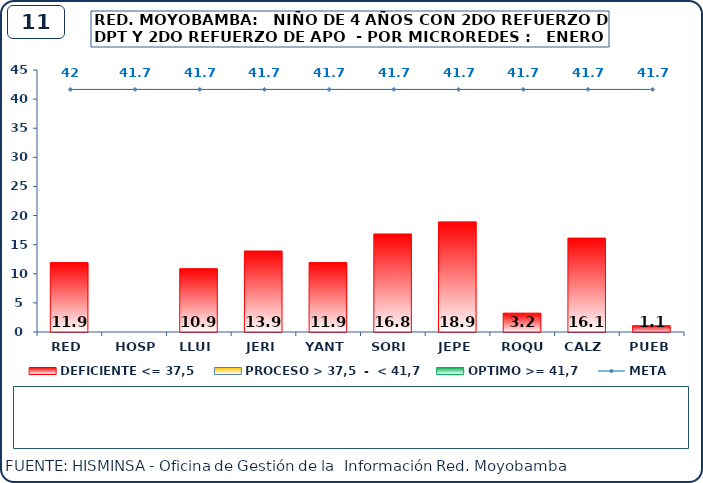
| Category | DEFICIENTE <= 37,5 | PROCESO > 37,5  -  < 41,7 | OPTIMO >= 41,7 |
|---|---|---|---|
| RED | 11.93 | 0 | 0 |
| HOSP | 0 | 0 | 0 |
| LLUI | 10.88 | 0 | 0 |
| JERI | 13.91 | 0 | 0 |
| YANT | 11.93 | 0 | 0 |
| SORI | 16.84 | 0 | 0 |
| JEPE | 18.92 | 0 | 0 |
| ROQU | 3.24 | 0 | 0 |
| CALZ | 16.13 | 0 | 0 |
| PUEB | 1.09 | 0 | 0 |